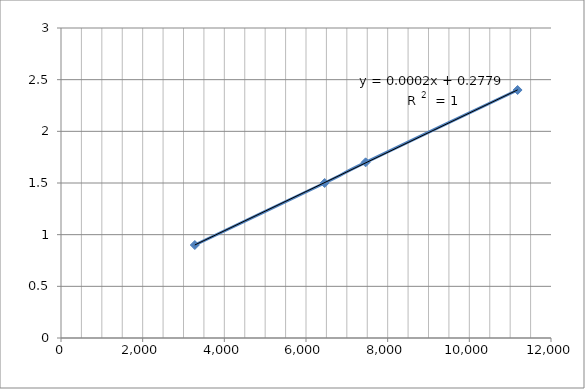
| Category | Series 0 |
|---|---|
| 3276.9917501473187 | 0.9 |
| 6456.8874484384205 | 1.5 |
| 7460.213317619327 | 1.7 |
| 11182.228638774306 | 2.4 |